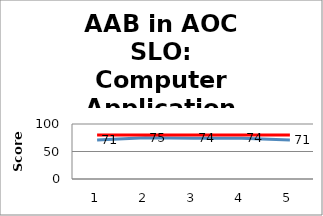
| Category | Avg Scores | Goal |
|---|---|---|
| 0 | 71 | 80 |
| 1 | 75 | 80 |
| 2 | 74 | 80 |
| 3 | 74 | 80 |
| 4 | 71 | 80 |